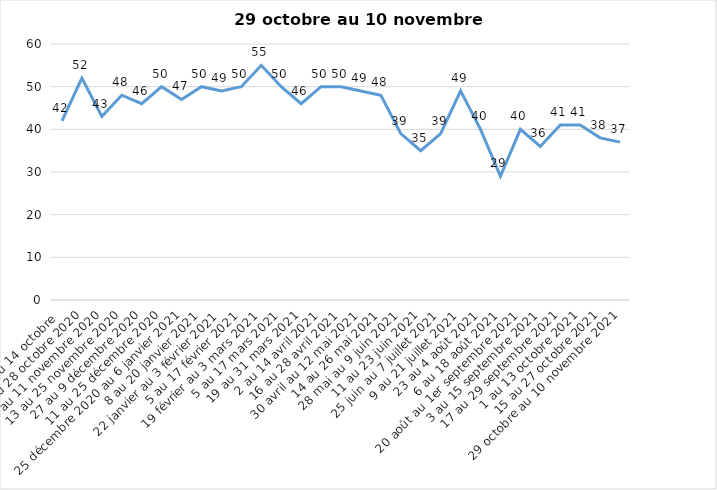
| Category | Toujours aux trois mesures |
|---|---|
| 2 au 14 octobre  | 42 |
| 16 au 28 octobre 2020 | 52 |
| 30 octobre au 11 novembre 2020 | 43 |
| 13 au 25 novembre 2020 | 48 |
| 27 au 9 décembre 2020 | 46 |
| 11 au 25 décembre 2020 | 50 |
| 25 décembre 2020 au 6 janvier 2021 | 47 |
| 8 au 20 janvier 2021 | 50 |
| 22 janvier au 3 février 2021 | 49 |
| 5 au 17 février 2021 | 50 |
| 19 février au 3 mars 2021 | 55 |
| 5 au 17 mars 2021 | 50 |
| 19 au 31 mars 2021 | 46 |
| 2 au 14 avril 2021 | 50 |
| 16 au 28 avril 2021 | 50 |
| 30 avril au 12 mai 2021 | 49 |
| 14 au 26 mai 2021 | 48 |
| 28 mai au 9 juin 2021 | 39 |
| 11 au 23 juin 2021 | 35 |
| 25 juin au 7 juillet 2021 | 39 |
| 9 au 21 juillet 2021 | 49 |
| 23 au 4 août 2021 | 40 |
| 6 au 18 août 2021 | 29 |
| 20 août au 1er septembre 2021 | 40 |
| 3 au 15 septembre 2021 | 36 |
| 17 au 29 septembre 2021 | 41 |
| 1 au 13 octobre 2021 | 41 |
| 15 au 27 octobre 2021 | 38 |
| 29 octobre au 10 novembre 2021 | 37 |